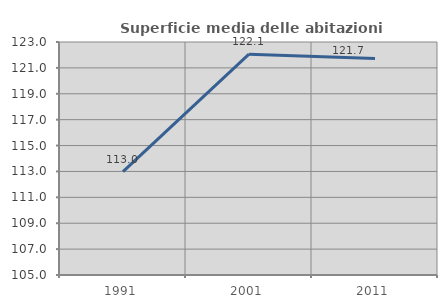
| Category | Superficie media delle abitazioni occupate |
|---|---|
| 1991.0 | 112.993 |
| 2001.0 | 122.06 |
| 2011.0 | 121.718 |